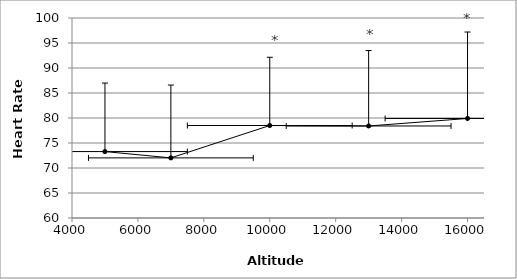
| Category | Series 0 |
|---|---|
| 5000.0 | 73.286 |
| 7000.0 | 72.024 |
| 10000.0 | 78.5 |
| 13000.0 | 78.405 |
| 16000.0 | 79.905 |